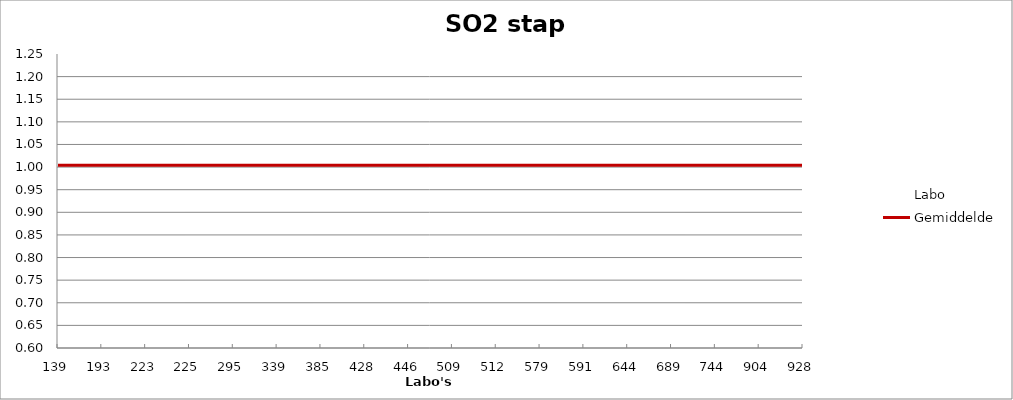
| Category | Labo | Gemiddelde |
|---|---|---|
| 139.0 | 1.232 | 1.004 |
| 193.0 | 0.973 | 1.004 |
| 223.0 | 1.091 | 1.004 |
| 225.0 | 0.994 | 1.004 |
| 295.0 | 0.994 | 1.004 |
| 339.0 | 0.931 | 1.004 |
| 385.0 | 1.044 | 1.004 |
| 428.0 | 0.962 | 1.004 |
| 446.0 | 0.959 | 1.004 |
| 509.0 | 1.034 | 1.004 |
| 512.0 | 0.606 | 1.004 |
| 579.0 | 0.994 | 1.004 |
| 591.0 | 1.07 | 1.004 |
| 644.0 | 0.983 | 1.004 |
| 689.0 | 1.124 | 1.004 |
| 744.0 | 0.949 | 1.004 |
| 904.0 | 1.021 | 1.004 |
| 928.0 | 0.958 | 1.004 |